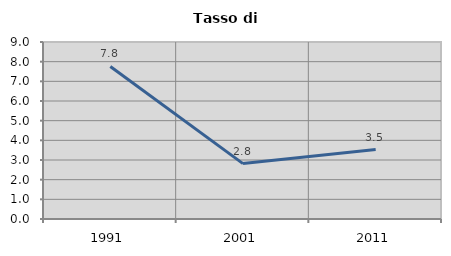
| Category | Tasso di disoccupazione   |
|---|---|
| 1991.0 | 7.756 |
| 2001.0 | 2.817 |
| 2011.0 | 3.533 |